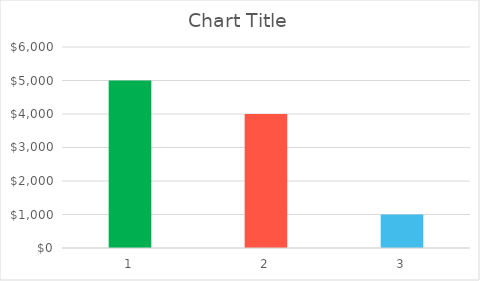
| Category | Series 0 |
|---|---|
| 0 | 5000 |
| 1 | 4000 |
| 2 | 1000 |